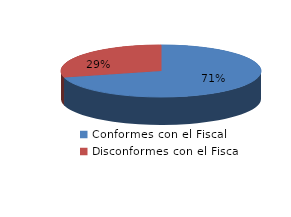
| Category | Series 0 |
|---|---|
| 0 | 322 |
| 1 | 132 |